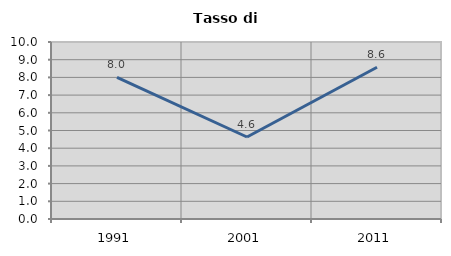
| Category | Tasso di disoccupazione   |
|---|---|
| 1991.0 | 8 |
| 2001.0 | 4.633 |
| 2011.0 | 8.576 |